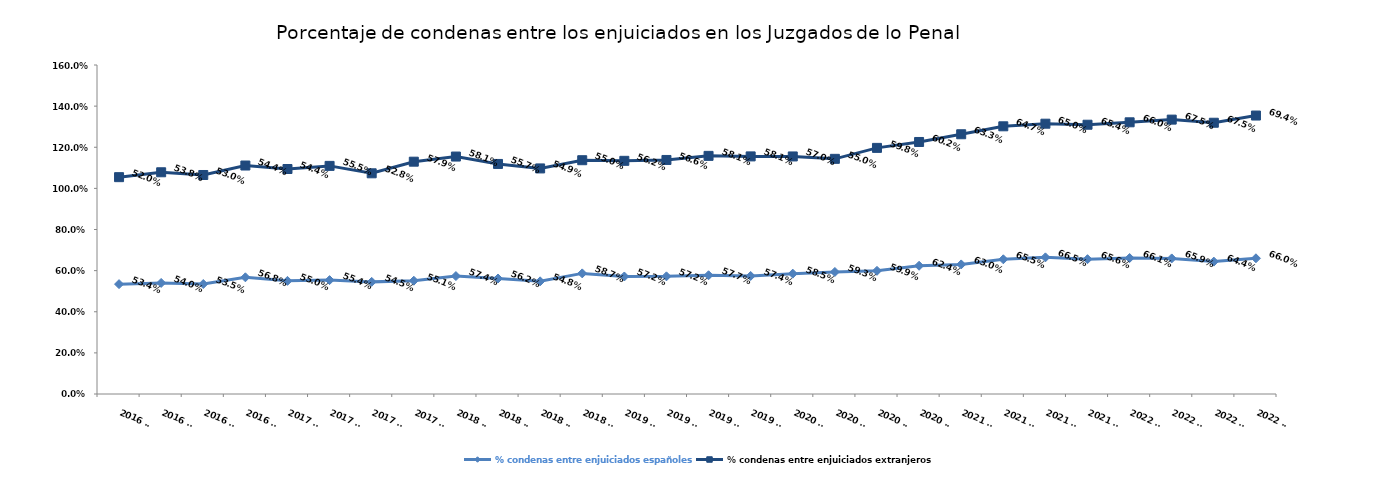
| Category | % condenas entre enjuiciados españoles | % condenas entre enjuiciados extranjeros |
|---|---|---|
| 2016 T1 | 0.534 | 0.52 |
| 2016 T2 | 0.54 | 0.538 |
| 2016 T3 | 0.535 | 0.53 |
| 2016 T4 | 0.568 | 0.544 |
| 2017 T1 | 0.55 | 0.544 |
| 2017 T2 | 0.554 | 0.555 |
| 2017 T3 | 0.545 | 0.528 |
| 2017 T4 | 0.551 | 0.579 |
| 2018 T1 | 0.574 | 0.581 |
| 2018 T2 | 0.562 | 0.557 |
| 2018 T3 | 0.548 | 0.549 |
| 2018 T4 | 0.587 | 0.55 |
| 2019 T1 | 0.572 | 0.562 |
| 2019 T2 | 0.572 | 0.566 |
| 2019 T3 | 0.577 | 0.581 |
| 2019 T4 | 0.574 | 0.581 |
| 2020 T1 | 0.585 | 0.57 |
| 2020 T2 | 0.593 | 0.55 |
| 2020 T3 | 0.599 | 0.598 |
| 2020 T4 | 0.624 | 0.602 |
| 2021 T1 | 0.63 | 0.633 |
| 2021 T2 | 0.655 | 0.647 |
| 2021 T3 | 0.665 | 0.65 |
| 2021 T4 | 0.656 | 0.654 |
| 2022 T1 | 0.661 | 0.66 |
| 2022 T2 | 0.659 | 0.675 |
| 2022 T3 | 0.644 | 0.675 |
| 2022 T4 | 0.66 | 0.694 |